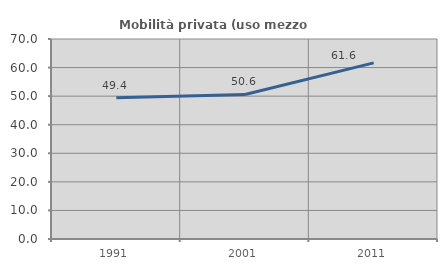
| Category | Mobilità privata (uso mezzo privato) |
|---|---|
| 1991.0 | 49.43 |
| 2001.0 | 50.58 |
| 2011.0 | 61.648 |